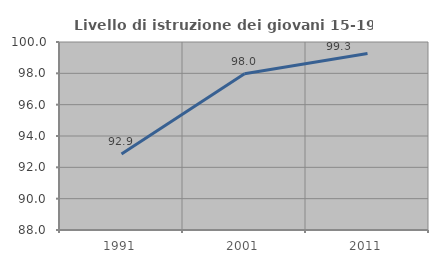
| Category | Livello di istruzione dei giovani 15-19 anni |
|---|---|
| 1991.0 | 92.857 |
| 2001.0 | 97.973 |
| 2011.0 | 99.265 |